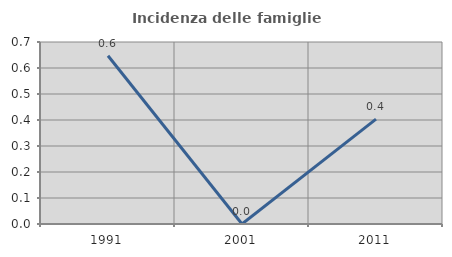
| Category | Incidenza delle famiglie numerose |
|---|---|
| 1991.0 | 0.647 |
| 2001.0 | 0 |
| 2011.0 | 0.403 |